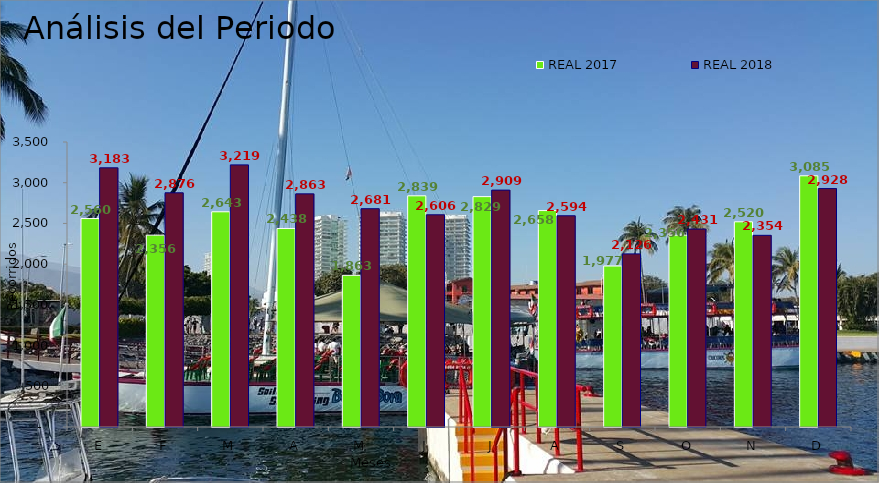
| Category | REAL 2017 | REAL 2018 |
|---|---|---|
| E | 2560 | 3183 |
| F | 2356 | 2876 |
| M | 2643 | 3219 |
| A | 2438 | 2863 |
| M | 1863 | 2681 |
| J | 2839 | 2606 |
| J | 2829 | 2909 |
| A | 2658 | 2594 |
| S | 1977 | 2126 |
| O | 2356 | 2431 |
| N | 2520 | 2354 |
| D | 3085 | 2928 |